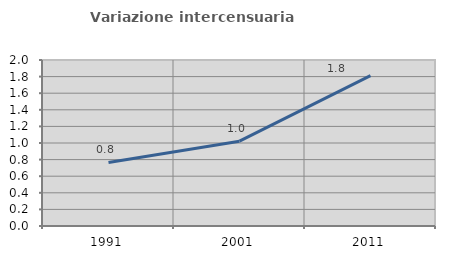
| Category | Variazione intercensuaria annua |
|---|---|
| 1991.0 | 0.765 |
| 2001.0 | 1.022 |
| 2011.0 | 1.812 |